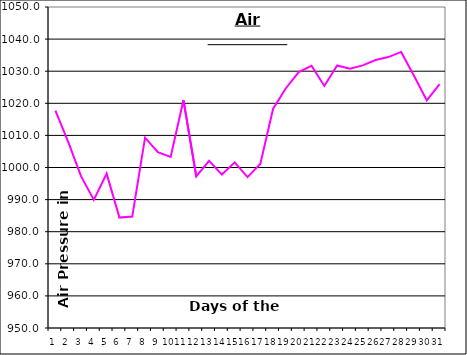
| Category | Series 0 |
|---|---|
| 0 | 1017.7 |
| 1 | 1008 |
| 2 | 997.3 |
| 3 | 989.9 |
| 4 | 998.1 |
| 5 | 984.4 |
| 6 | 984.7 |
| 7 | 1009.3 |
| 8 | 1004.8 |
| 9 | 1003.3 |
| 10 | 1021 |
| 11 | 997.2 |
| 12 | 1002.1 |
| 13 | 997.8 |
| 14 | 1001.6 |
| 15 | 997 |
| 16 | 1001.1 |
| 17 | 1018.3 |
| 18 | 1024.7 |
| 19 | 1029.7 |
| 20 | 1031.7 |
| 21 | 1025.4 |
| 22 | 1031.8 |
| 23 | 1030.8 |
| 24 | 1031.8 |
| 25 | 1033.5 |
| 26 | 1034.4 |
| 27 | 1036 |
| 28 | 1028.6 |
| 29 | 1020.9 |
| 30 | 1026 |